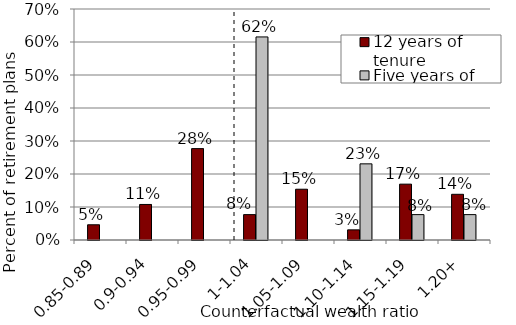
| Category | 12 years of tenure | Five years of tenure |
|---|---|---|
| 0.85-0.89 | 0.046 | 0 |
| 0.9-0.94 | 0.108 | 0 |
| 0.95-0.99 | 0.277 | 0 |
| 1-1.04 | 0.077 | 0.615 |
| 1.05-1.09 | 0.154 | 0 |
| 1.10-1.14 | 0.031 | 0.231 |
| 1.15-1.19 | 0.169 | 0.077 |
| 1.20+ | 0.138 | 0.077 |